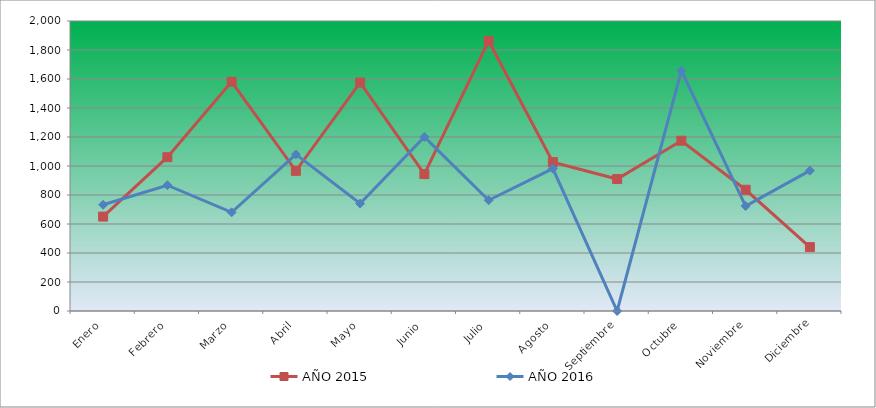
| Category | AÑO 2015 | AÑO 2016 |
|---|---|---|
| Enero | 651.169 | 732.399 |
| Febrero | 1060.638 | 867.391 |
| Marzo | 1581.005 | 680.701 |
| Abril | 966.801 | 1079.93 |
| Mayo | 1575.318 | 741.016 |
| Junio | 944.053 | 1200.56 |
| Julio | 1862.514 | 763.993 |
| Agosto | 1026.516 | 982.277 |
| Septiembre | 909.931 | 0 |
| Octubre | 1174.379 | 1657.233 |
| Noviembre | 835.999 | 723.783 |
| Diciembre | 440.748 | 967.916 |